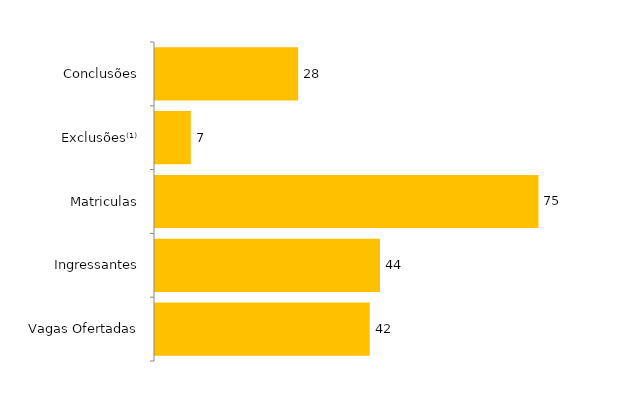
| Category | Total (2018) |
|---|---|
| Vagas Ofertadas | 42 |
| Ingressantes | 44 |
| Matriculas | 75 |
| Exclusões⁽¹⁾ | 7 |
| Conclusões | 28 |